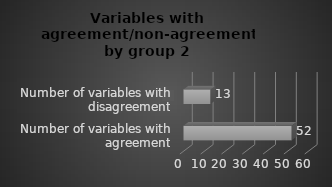
| Category | Series 2 |
|---|---|
| Number of variables with agreement | 52 |
| Number of variables with disagreement | 13 |